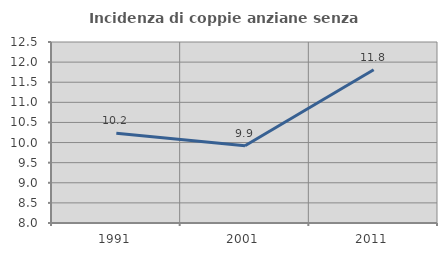
| Category | Incidenza di coppie anziane senza figli  |
|---|---|
| 1991.0 | 10.234 |
| 2001.0 | 9.92 |
| 2011.0 | 11.811 |